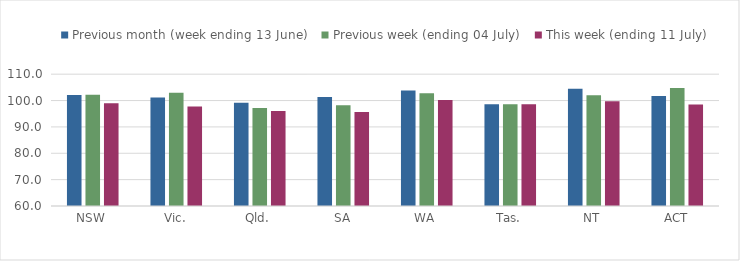
| Category | Previous month (week ending 13 June) | Previous week (ending 04 July) | This week (ending 11 July) |
|---|---|---|---|
| NSW | 102.112 | 102.224 | 99.012 |
| Vic. | 101.118 | 102.948 | 97.789 |
| Qld. | 99.191 | 97.219 | 96.001 |
| SA | 101.317 | 98.209 | 95.66 |
| WA | 103.808 | 102.806 | 100.17 |
| Tas. | 98.603 | 98.603 | 98.603 |
| NT | 104.471 | 102.03 | 99.766 |
| ACT | 101.757 | 104.729 | 98.46 |